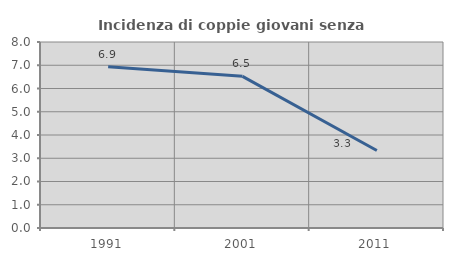
| Category | Incidenza di coppie giovani senza figli |
|---|---|
| 1991.0 | 6.933 |
| 2001.0 | 6.522 |
| 2011.0 | 3.333 |